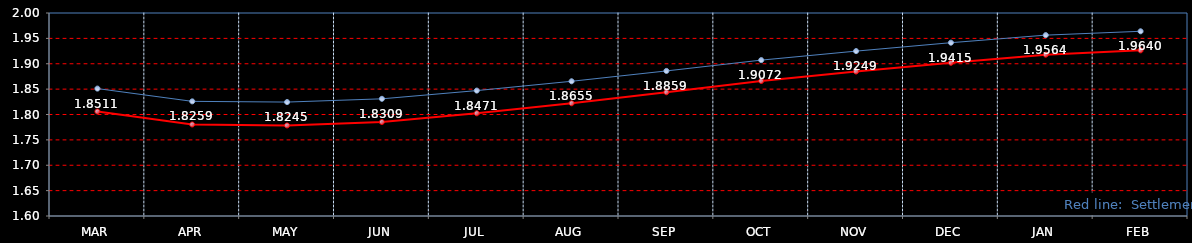
| Category | Last | Settlement |
|---|---|---|
| MAR | 1.851 | 1.806 |
| APR | 1.826 | 1.78 |
| MAY | 1.824 | 1.778 |
| JUN | 1.831 | 1.785 |
| JUL | 1.847 | 1.802 |
| AUG | 1.865 | 1.822 |
| SEP | 1.886 | 1.844 |
| OCT | 1.907 | 1.866 |
| NOV | 1.925 | 1.885 |
| DEC | 1.942 | 1.902 |
| JAN | 1.956 | 1.918 |
| FEB | 1.964 | 1.926 |